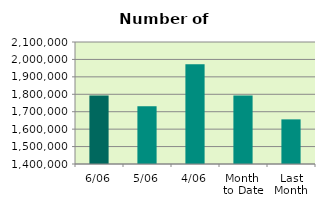
| Category | Series 0 |
|---|---|
| 6/06 | 1793030 |
| 5/06 | 1731902 |
| 4/06 | 1972958 |
| Month 
to Date | 1792906.5 |
| Last
Month | 1656073.545 |